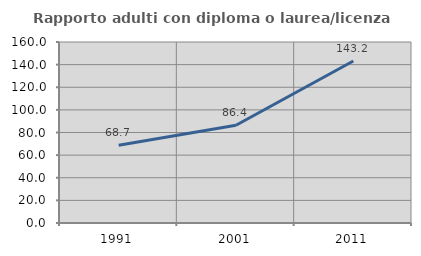
| Category | Rapporto adulti con diploma o laurea/licenza media  |
|---|---|
| 1991.0 | 68.699 |
| 2001.0 | 86.423 |
| 2011.0 | 143.194 |